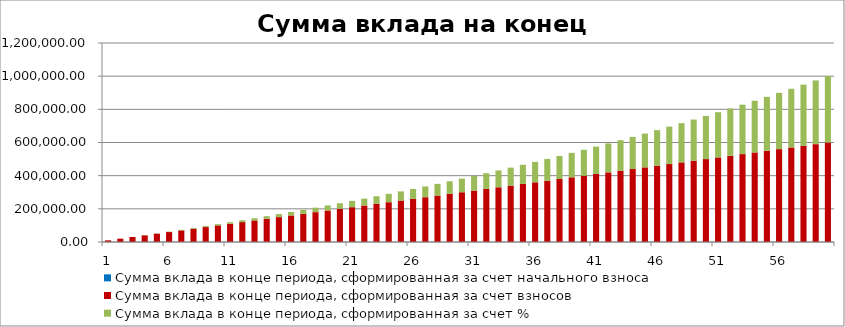
| Category | Сумма вклада в конце периода, сформированная за счет начального взноса | Сумма вклада в конце периода, сформированная за счет взносов | Сумма вклада в конце периода, сформированная за счет % |
|---|---|---|---|
| 0 | 0 | 10000 | 0 |
| 1 | 0 | 20000 | 161.503 |
| 2 | 0 | 30000 | 487.116 |
| 3 | 0 | 40000 | 979.491 |
| 4 | 0 | 50000 | 1641.321 |
| 5 | 0 | 60000 | 2475.342 |
| 6 | 0 | 70000 | 3484.335 |
| 7 | 0 | 80000 | 4671.127 |
| 8 | 0 | 90000 | 6038.588 |
| 9 | 0 | 100000 | 7589.637 |
| 10 | 0 | 110000 | 9327.238 |
| 11 | 0 | 120000 | 11254.405 |
| 12 | 0 | 130000 | 13374.198 |
| 13 | 0 | 140000 | 15689.73 |
| 14 | 0 | 150000 | 18204.16 |
| 15 | 0 | 160000 | 20920.702 |
| 16 | 0 | 170000 | 23842.62 |
| 17 | 0 | 180000 | 26973.23 |
| 18 | 0 | 190000 | 30315.902 |
| 19 | 0 | 200000 | 33874.063 |
| 20 | 0 | 210000 | 37651.191 |
| 21 | 0 | 220000 | 41650.824 |
| 22 | 0 | 230000 | 45876.554 |
| 23 | 0 | 240000 | 50332.034 |
| 24 | 0 | 250000 | 55020.974 |
| 25 | 0 | 260000 | 59947.143 |
| 26 | 0 | 270000 | 65114.375 |
| 27 | 0 | 280000 | 70526.561 |
| 28 | 0 | 290000 | 76187.658 |
| 29 | 0 | 300000 | 82101.686 |
| 30 | 0 | 310000 | 88272.73 |
| 31 | 0 | 320000 | 94704.941 |
| 32 | 0 | 330000 | 101402.536 |
| 33 | 0 | 340000 | 108369.802 |
| 34 | 0 | 350000 | 115611.093 |
| 35 | 0 | 360000 | 123130.836 |
| 36 | 0 | 370000 | 130933.528 |
| 37 | 0 | 380000 | 139023.737 |
| 38 | 0 | 390000 | 147406.109 |
| 39 | 0 | 400000 | 156085.36 |
| 40 | 0 | 410000 | 165066.287 |
| 41 | 0 | 420000 | 174353.76 |
| 42 | 0 | 430000 | 183952.732 |
| 43 | 0 | 440000 | 193868.232 |
| 44 | 0 | 450000 | 204105.372 |
| 45 | 0 | 460000 | 214669.348 |
| 46 | 0 | 470000 | 225565.437 |
| 47 | 0 | 480000 | 236799.004 |
| 48 | 0 | 490000 | 248375.499 |
| 49 | 0 | 500000 | 260300.46 |
| 50 | 0 | 510000 | 272579.514 |
| 51 | 0 | 520000 | 285218.382 |
| 52 | 0 | 530000 | 298222.873 |
| 53 | 0 | 540000 | 311598.892 |
| 54 | 0 | 550000 | 325352.441 |
| 55 | 0 | 560000 | 339489.616 |
| 56 | 0 | 570000 | 354016.612 |
| 57 | 0 | 580000 | 368939.726 |
| 58 | 0 | 590000 | 384265.355 |
| 59 | 0 | 600000 | 400000 |